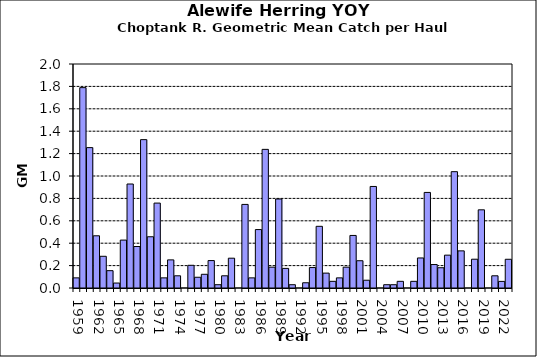
| Category | Series 0 |
|---|---|
| 1959.0 | 0.091 |
| 1960.0 | 1.789 |
| 1961.0 | 1.253 |
| 1962.0 | 0.466 |
| 1963.0 | 0.283 |
| 1964.0 | 0.155 |
| 1965.0 | 0.044 |
| 1966.0 | 0.428 |
| 1967.0 | 0.929 |
| 1968.0 | 0.37 |
| 1969.0 | 1.325 |
| 1970.0 | 0.458 |
| 1971.0 | 0.758 |
| 1972.0 | 0.091 |
| 1973.0 | 0.251 |
| 1974.0 | 0.109 |
| 1975.0 | 0 |
| 1976.0 | 0.203 |
| 1977.0 | 0.096 |
| 1978.0 | 0.122 |
| 1979.0 | 0.245 |
| 1980.0 | 0.029 |
| 1981.0 | 0.109 |
| 1982.0 | 0.266 |
| 1983.0 | 0 |
| 1984.0 | 0.746 |
| 1985.0 | 0.091 |
| 1986.0 | 0.522 |
| 1987.0 | 1.238 |
| 1988.0 | 0.186 |
| 1989.0 | 0.795 |
| 1990.0 | 0.175 |
| 1991.0 | 0.029 |
| 1992.0 | 0 |
| 1993.0 | 0.047 |
| 1994.0 | 0.183 |
| 1995.0 | 0.551 |
| 1996.0 | 0.133 |
| 1997.0 | 0.059 |
| 1998.0 | 0.091 |
| 1999.0 | 0.186 |
| 2000.0 | 0.469 |
| 2001.0 | 0.244 |
| 2002.0 | 0.069 |
| 2003.0 | 0.907 |
| 2004.0 | 0 |
| 2005.0 | 0.029 |
| 2006.0 | 0.029 |
| 2007.0 | 0.059 |
| 2008.0 | 0 |
| 2009.0 | 0.059 |
| 2010.0 | 0.268 |
| 2011.0 | 0.853 |
| 2012.0 | 0.209 |
| 2013.0 | 0.181 |
| 2014.0 | 0.293 |
| 2015.0 | 1.039 |
| 2016.0 | 0.332 |
| 2017.0 | 0 |
| 2018.0 | 0.257 |
| 2019.0 | 0.698 |
| 2020.0 | 0 |
| 2021.0 | 0.109 |
| 2022.0 | 0.059 |
| 2023.0 | 0.257 |